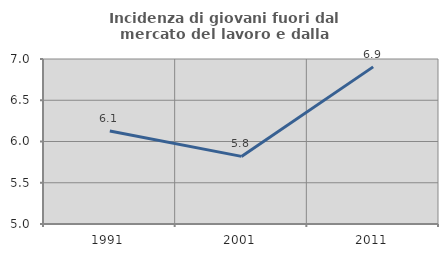
| Category | Incidenza di giovani fuori dal mercato del lavoro e dalla formazione  |
|---|---|
| 1991.0 | 6.126 |
| 2001.0 | 5.819 |
| 2011.0 | 6.905 |